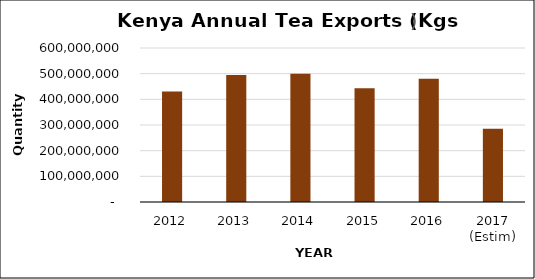
| Category | Tea Exports (Kgs) |
|---|---|
| 2012 | 430204569 |
| 2013 | 494377783 |
| 2014 | 499379621 |
| 2015 | 443043556.7 |
| 2016 | 480330227.98 |
| 2017 (Estim) | 285420959.3 |